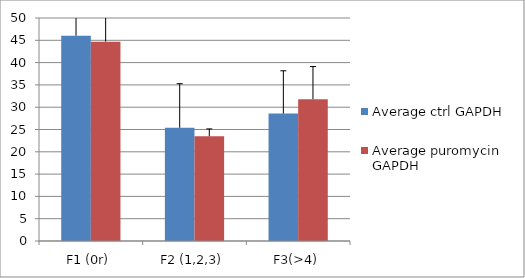
| Category | Average ctrl GAPDH | Average puromycin  GAPDH  |
|---|---|---|
| F1 (0r) | 46.037 | 44.701 |
| F2 (1,2,3) | 25.391 | 23.504 |
| F3(>4) | 28.572 | 31.795 |